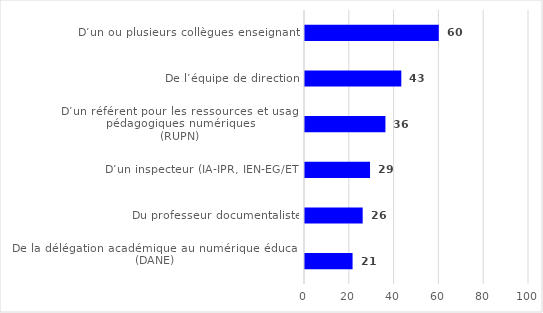
| Category | Series 0 |
|---|---|
| D’un ou plusieurs collègues enseignants | 59.725 |
| De l’équipe de direction | 42.994 |
| D’un référent pour les ressources et usages pédagogiques numériques 
(RUPN) | 35.907 |
| D’un inspecteur (IA-IPR, IEN-EG/ET) | 29.032 |
| Du professeur documentaliste | 25.746 |
| De la délégation académique au numérique éducatif 
(DANE) | 21.239 |